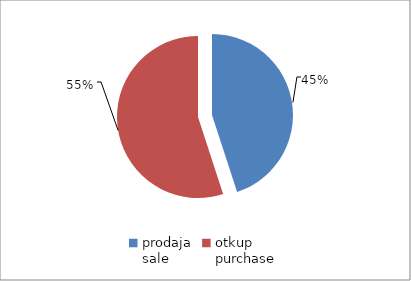
| Category | Series 0 |
|---|---|
| prodaja
sale | 14366067 |
| otkup
purchase | 17571719.4 |